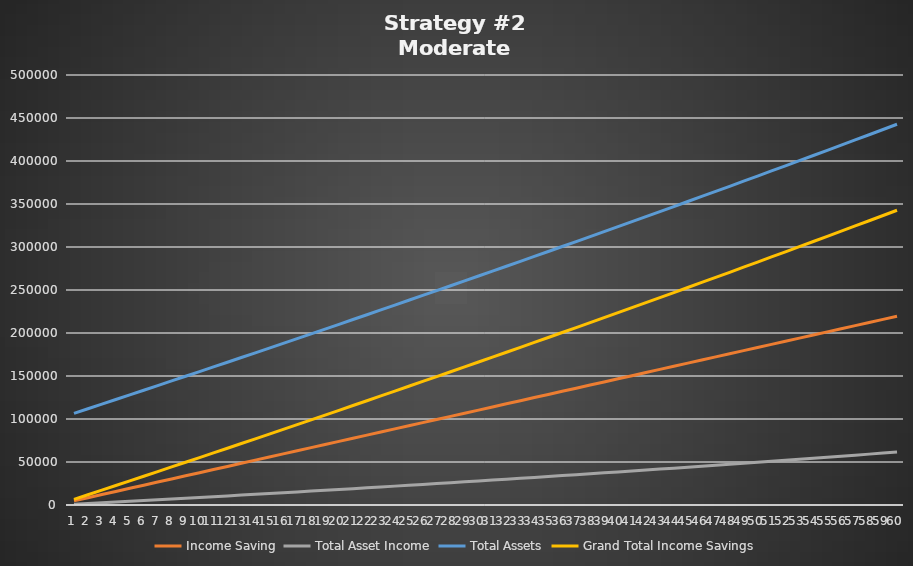
| Category | Income Saving | Total Asset Income | Total Assets | Grand Total Income Savings |
|---|---|---|---|---|
| 0 | 4839.338 | 853.479 | 106546.296 | 6546.296 |
| 1 | 8478.013 | 1711.956 | 111901.925 | 11901.925 |
| 2 | 12116.689 | 2575.47 | 117267.629 | 17267.629 |
| 3 | 15755.365 | 3444.062 | 122643.489 | 22643.489 |
| 4 | 19394.04 | 4317.774 | 128029.587 | 28029.587 |
| 5 | 23032.716 | 5196.645 | 133426.007 | 33426.007 |
| 6 | 26671.391 | 6080.719 | 138832.83 | 38832.83 |
| 7 | 30310.067 | 6970.037 | 144250.141 | 44250.141 |
| 8 | 33948.743 | 7864.641 | 149678.024 | 49678.024 |
| 9 | 37587.418 | 8764.573 | 155116.565 | 55116.565 |
| 10 | 41226.094 | 9669.878 | 160565.849 | 60565.849 |
| 11 | 44864.769 | 10580.597 | 166025.963 | 66025.963 |
| 12 | 48503.445 | 11496.775 | 171496.994 | 71496.994 |
| 13 | 52142.12 | 12418.455 | 176979.03 | 76979.03 |
| 14 | 55780.796 | 13345.682 | 182472.161 | 82472.161 |
| 15 | 59419.472 | 14278.501 | 187976.474 | 87976.474 |
| 16 | 63058.147 | 15216.957 | 193492.061 | 93492.061 |
| 17 | 66696.823 | 16161.095 | 199019.012 | 99019.012 |
| 18 | 70335.498 | 17110.96 | 204557.419 | 104557.419 |
| 19 | 73974.174 | 18066.6 | 210107.374 | 110107.374 |
| 20 | 77612.85 | 19028.06 | 215668.97 | 115668.97 |
| 21 | 81251.525 | 19995.388 | 221242.301 | 121242.301 |
| 22 | 84890.201 | 20968.631 | 226827.462 | 126827.462 |
| 23 | 88528.876 | 21947.836 | 232424.548 | 132424.548 |
| 24 | 92167.552 | 22933.051 | 238033.654 | 138033.654 |
| 25 | 95806.228 | 23924.325 | 243654.879 | 143654.879 |
| 26 | 99444.903 | 24921.708 | 249288.318 | 149288.318 |
| 27 | 103083.579 | 25925.247 | 254934.072 | 154934.072 |
| 28 | 106722.254 | 26934.992 | 260592.239 | 160592.239 |
| 29 | 110360.93 | 27950.995 | 266262.919 | 166262.919 |
| 30 | 113999.606 | 28973.304 | 271946.213 | 171946.213 |
| 31 | 117638.281 | 30001.971 | 277642.223 | 177642.223 |
| 32 | 121276.957 | 31037.047 | 283351.051 | 183351.051 |
| 33 | 124915.632 | 32078.584 | 289072.8 | 189072.8 |
| 34 | 128554.308 | 33126.634 | 294807.575 | 194807.575 |
| 35 | 132192.983 | 34181.249 | 300555.481 | 200555.481 |
| 36 | 135831.659 | 35242.482 | 306316.622 | 206316.622 |
| 37 | 139470.335 | 36310.386 | 312091.107 | 212091.107 |
| 38 | 143109.01 | 37385.016 | 317879.042 | 217879.042 |
| 39 | 146747.686 | 38466.425 | 323680.536 | 223680.536 |
| 40 | 150386.361 | 39554.669 | 329495.699 | 229495.699 |
| 41 | 154025.037 | 40649.801 | 335324.639 | 235324.639 |
| 42 | 157663.713 | 41751.878 | 341167.469 | 241167.469 |
| 43 | 161302.388 | 42860.956 | 347024.3 | 247024.3 |
| 44 | 164941.064 | 43977.091 | 352895.245 | 252895.245 |
| 45 | 168579.739 | 45100.34 | 358780.418 | 258780.418 |
| 46 | 172218.415 | 46230.759 | 364679.934 | 264679.934 |
| 47 | 175857.091 | 47368.408 | 370593.908 | 270593.908 |
| 48 | 179495.766 | 48513.345 | 376522.456 | 276522.456 |
| 49 | 183134.442 | 49665.627 | 382465.696 | 282465.696 |
| 50 | 186773.117 | 50825.314 | 388423.746 | 288423.746 |
| 51 | 190411.793 | 51992.467 | 394396.726 | 294396.726 |
| 52 | 194050.469 | 53167.144 | 400384.757 | 300384.757 |
| 53 | 197689.144 | 54349.407 | 406387.958 | 306387.958 |
| 54 | 201327.82 | 55539.317 | 412406.454 | 312406.454 |
| 55 | 204966.495 | 56736.935 | 418440.366 | 318440.366 |
| 56 | 208605.171 | 57942.324 | 424489.819 | 324489.819 |
| 57 | 212243.846 | 59155.546 | 430554.938 | 330554.938 |
| 58 | 215882.522 | 60376.664 | 436635.85 | 336635.85 |
| 59 | 219521.198 | 61605.742 | 442732.682 | 342732.682 |